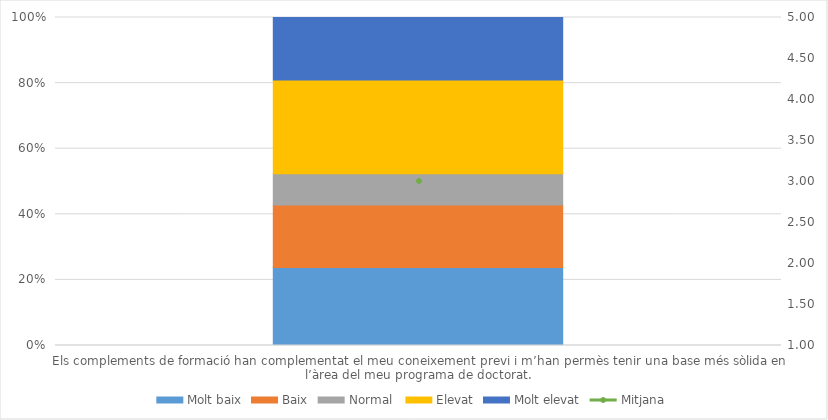
| Category | Molt baix | Baix | Normal  | Elevat | Molt elevat |
|---|---|---|---|---|---|
| Els complements de formació han complementat el meu coneixement previ i m’han permès tenir una base més sòlida en l’àrea del meu programa de doctorat. | 5 | 4 | 2 | 6 | 4 |